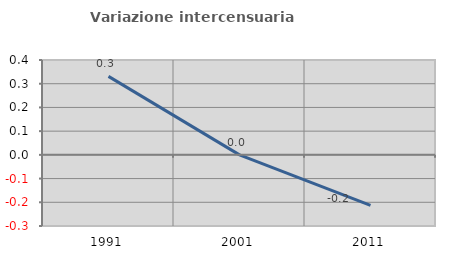
| Category | Variazione intercensuaria annua |
|---|---|
| 1991.0 | 0.331 |
| 2001.0 | 0 |
| 2011.0 | -0.213 |